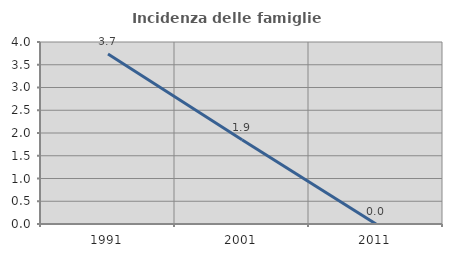
| Category | Incidenza delle famiglie numerose |
|---|---|
| 1991.0 | 3.738 |
| 2001.0 | 1.852 |
| 2011.0 | 0 |